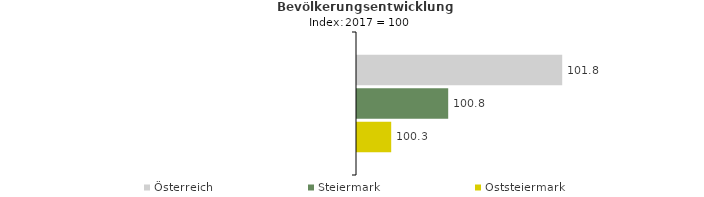
| Category | Österreich | Steiermark | Oststeiermark |
|---|---|---|---|
| 2021.0 | 101.8 | 100.8 | 100.3 |